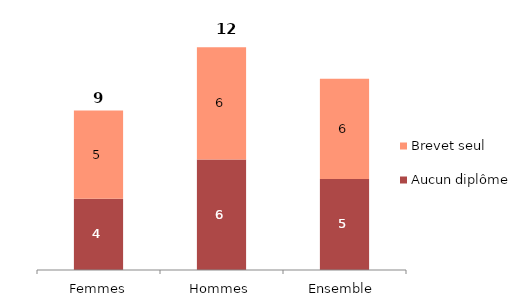
| Category | Aucun diplôme | Brevet seul |
|---|---|---|
| Ensemble  | 5.059 | 5.568 |
| Hommes | 6.142 | 6.233 |
| Femmes | 3.965 | 4.897 |